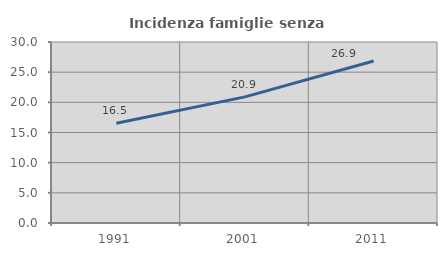
| Category | Incidenza famiglie senza nuclei |
|---|---|
| 1991.0 | 16.529 |
| 2001.0 | 20.903 |
| 2011.0 | 26.854 |